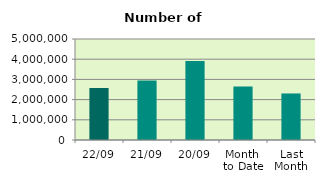
| Category | Series 0 |
|---|---|
| 22/09 | 2572206 |
| 21/09 | 2949566 |
| 20/09 | 3909042 |
| Month 
to Date | 2648842 |
| Last
Month | 2303894.727 |